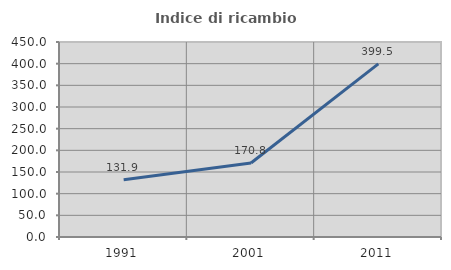
| Category | Indice di ricambio occupazionale  |
|---|---|
| 1991.0 | 131.91 |
| 2001.0 | 170.796 |
| 2011.0 | 399.454 |